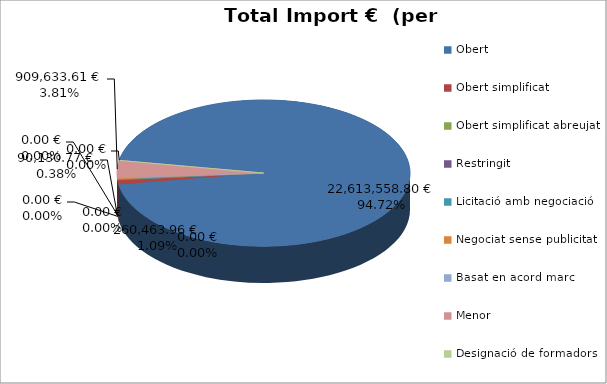
| Category | Total preu              (amb iva) |
|---|---|
| Obert | 22613558.8 |
| Obert simplificat | 260463.959 |
| Obert simplificat abreujat | 0 |
| Restringit | 0 |
| Licitació amb negociació | 0 |
| Negociat sense publicitat | 90130.77 |
| Basat en acord marc | 0 |
| Menor | 909633.605 |
| Designació de formadors | 0 |